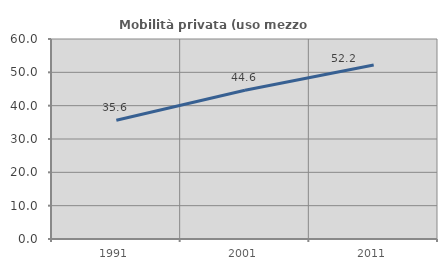
| Category | Mobilità privata (uso mezzo privato) |
|---|---|
| 1991.0 | 35.623 |
| 2001.0 | 44.601 |
| 2011.0 | 52.177 |